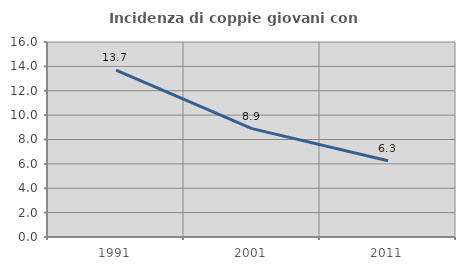
| Category | Incidenza di coppie giovani con figli |
|---|---|
| 1991.0 | 13.692 |
| 2001.0 | 8.894 |
| 2011.0 | 6.25 |